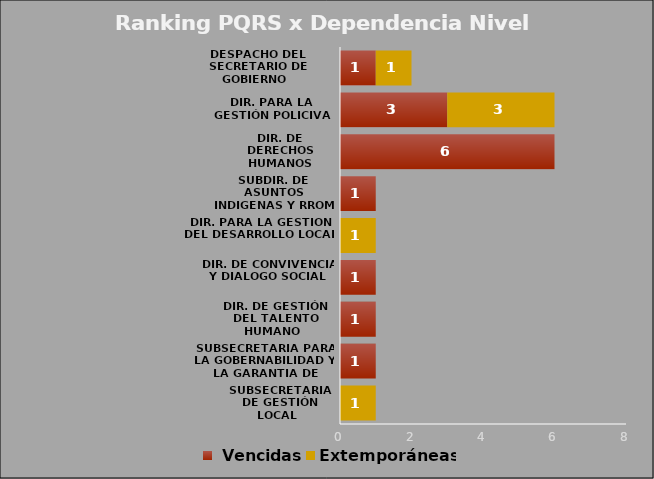
| Category |  Vencidas | Extemporáneas |
|---|---|---|
| SUBSECRETARIA DE GESTIÓN LOCAL  | 0 | 1 |
| SUBSECRETARIA PARA LA GOBERNABILIDAD Y LA GARANTIA DE DERECHOS | 1 | 0 |
| DIR. DE GESTIÓN DEL TALENTO HUMANO  | 1 | 0 |
| DIR. DE CONVIVENCIA Y DIALOGO SOCIAL  | 1 | 0 |
| DIR. PARA LA GESTION DEL DESARROLLO LOCAL | 0 | 1 |
| SUBDIR. DE ASUNTOS INDIGENAS Y RROM | 1 | 0 |
| DIR. DE DERECHOS HUMANOS | 6 | 0 |
| DIR. PARA LA GESTIÓN POLICIVA | 3 | 3 |
| DESPACHO DEL SECRETARIO DE GOBIERNO  | 1 | 1 |